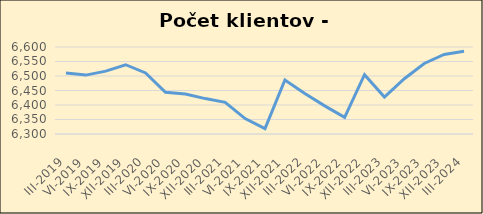
| Category | Series 0 |
|---|---|
| III-2019 | 6510281 |
| VI-2019 | 6503083 |
| IX-2019 | 6516788 |
| XII-2019 | 6538871 |
| III-2020 | 6510483 |
| VI-2020 | 6443793 |
| IX-2020 | 6437662 |
| XII-2020 | 6422104 |
| III-2021 | 6409348 |
| VI-2021 | 6353099 |
| IX-2021 | 6318740 |
| XII-2021 | 6486316 |
| III-2022 | 6439906 |
| VI-2022 | 6397084 |
| IX-2022 | 6357525 |
| XII-2022 | 6504628 |
| III-2023 | 6427266 |
| VI-2023 | 6490653 |
| IX-2023 | 6543313 |
| XII-2023 | 6574370 |
| III-2024 | 6585105 |